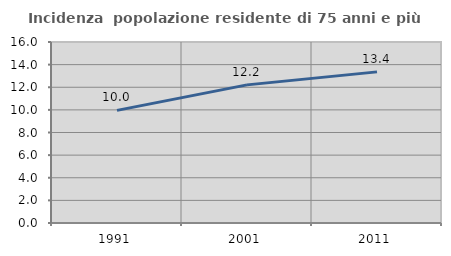
| Category | Incidenza  popolazione residente di 75 anni e più |
|---|---|
| 1991.0 | 9.957 |
| 2001.0 | 12.209 |
| 2011.0 | 13.359 |